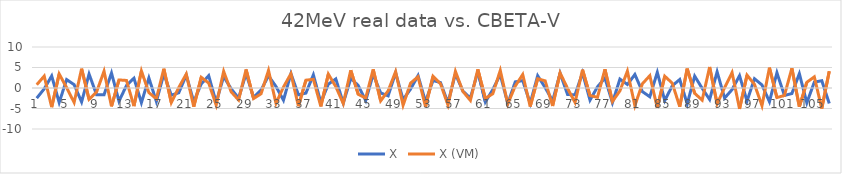
| Category | X | X (VM) |
|---|---|---|
| 0 | -2.485 | 0.797 |
| 1 | -0.204 | 2.905 |
| 2 | 2.94 | -4.675 |
| 3 | -3.53 | 3.427 |
| 4 | 2.058 | 0.081 |
| 5 | 0.812 | -3.53 |
| 6 | -3.397 | 4.703 |
| 7 | 3.394 | -2.756 |
| 8 | -1.624 | -0.987 |
| 9 | -1.644 | 4.095 |
| 10 | 3.648 | -4.479 |
| 11 | -3.221 | 1.963 |
| 12 | 0.595 | 1.844 |
| 13 | 2.391 | -4.424 |
| 14 | -3.583 | 4.152 |
| 15 | 2.45 | -1.134 |
| 16 | -3.294 | -2.622 |
| 17 | 3.433 | 4.701 |
| 18 | -1.753 | -3.565 |
| 19 | -1.164 | 0.123 |
| 20 | 3.145 | 3.41 |
| 21 | -3.364 | -4.568 |
| 22 | 0.989 | 2.611 |
| 23 | 3.005 | 1.199 |
| 24 | -3.527 | -4.154 |
| 25 | 2.798 | 4.056 |
| 26 | -0.185 | -0.92 |
| 27 | -2.466 | -2.926 |
| 28 | 3.52 | 4.519 |
| 29 | -2.328 | -2.573 |
| 30 | -0.499 | -1.418 |
| 31 | 2.966 | 4.29 |
| 32 | 0.366 | -3.752 |
| 33 | -2.98 | 0.223 |
| 34 | 3.501 | 3.485 |
| 35 | -1.648 | -4.435 |
| 36 | -1.245 | 1.907 |
| 37 | 3.204 | 2.111 |
| 38 | -3.551 | -4.485 |
| 39 | 0.93 | 3.388 |
| 40 | 2.212 | 0.327 |
| 41 | -3.68 | -3.79 |
| 42 | 2.326 | 4.332 |
| 43 | 0.619 | -1.534 |
| 44 | -3.079 | -2.447 |
| 45 | 3.359 | 4.541 |
| 46 | -1.194 | -3.134 |
| 47 | -1.917 | -0.688 |
| 48 | 3.718 | 3.98 |
| 49 | -2.819 | -4.204 |
| 50 | -0.266 | 1.186 |
| 51 | 3.032 | 2.746 |
| 52 | -3.348 | -4.561 |
| 53 | 1.823 | 2.86 |
| 54 | 1.335 | 1.046 |
| 55 | -3.598 | -4.145 |
| 56 | 3.437 | 4.05 |
| 57 | -0.759 | -0.832 |
| 58 | -2.459 | -3.027 |
| 59 | 4.026 | 4.552 |
| 60 | -3.409 | -2.568 |
| 61 | -0.37 | -1.396 |
| 62 | 3.258 | 4.284 |
| 63 | -3.79 | -3.869 |
| 64 | 1.496 | 0.472 |
| 65 | 1.804 | 3.289 |
| 66 | -3.748 | -4.515 |
| 67 | 2.991 | 2.26 |
| 68 | 0.109 | 1.74 |
| 69 | -3.136 | -4.388 |
| 70 | 3.606 | 3.68 |
| 71 | -1.614 | -0.108 |
| 72 | -1.621 | -3.535 |
| 73 | 3.685 | 4.473 |
| 74 | -2.966 | -1.845 |
| 75 | 0.29 | -2.267 |
| 76 | 2.423 | 4.577 |
| 77 | -3.586 | -3.287 |
| 78 | 2.18 | -0.691 |
| 79 | 0.862 | 4.111 |
| 80 | 3.3 | -4.296 |
| 81 | -0.869 | 1.022 |
| 82 | -2.139 | 3.007 |
| 83 | 3.818 | -4.848 |
| 84 | -3.073 | 2.875 |
| 85 | 0.538 | 1.183 |
| 86 | 2.075 | -4.556 |
| 87 | -3.861 | 4.719 |
| 88 | 2.899 | -1.302 |
| 89 | -0.072 | -2.955 |
| 90 | -2.814 | 5.124 |
| 91 | 3.947 | -3.854 |
| 92 | -2.46 | 0.08 |
| 93 | -0.397 | 3.754 |
| 94 | 3.01 | -5.087 |
| 95 | -3.182 | 3.137 |
| 96 | 2.256 | 0.88 |
| 97 | 0.735 | -4.308 |
| 98 | -3.335 | 4.964 |
| 99 | 3.724 | -2.326 |
| 100 | -1.825 | -1.828 |
| 101 | -1.349 | 4.805 |
| 102 | 3.485 | -4.583 |
| 103 | -3.613 | 1.391 |
| 104 | 1.429 | 2.716 |
| 105 | 1.777 | -5.014 |
| 106 | -3.763 | 4.08 |